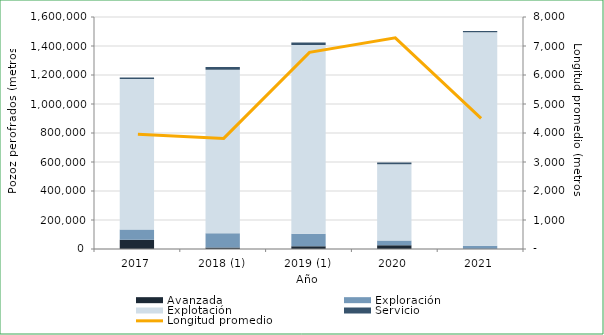
| Category | Avanzada  | Exploración  | Explotación  | Servicio  |
|---|---|---|---|---|
| 2017 | 63906.5 | 70748.85 | 1038581.59 | 10078.8 |
| 2018 (1) | 11126 | 97611 | 1127612.47 | 18431 |
| 2019 (1) | 18457 | 87260 | 1301965.08 | 16154 |
| 2020 | 26497 | 31993 | 525211.17 | 13494 |
| 2021 | 0 | 23212 | 1472014.18 | 7721.52 |